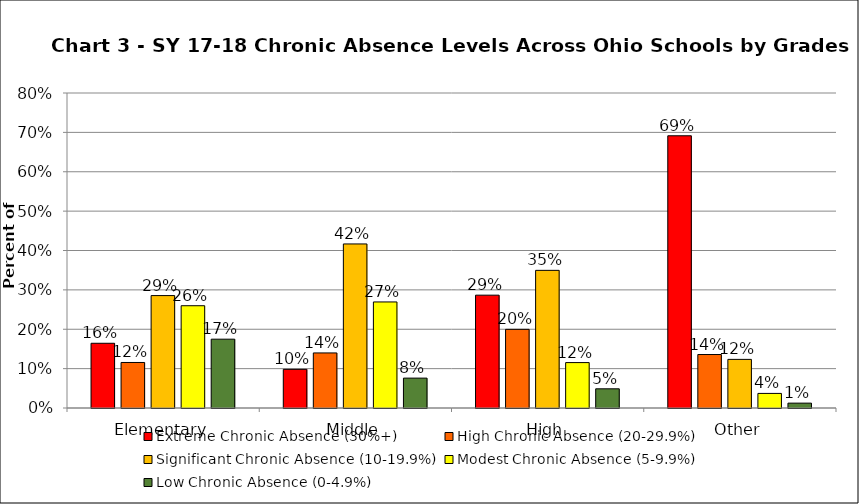
| Category | Extreme Chronic Absence (30%+) | High Chronic Absence (20-29.9%) | Significant Chronic Absence (10-19.9%) | Modest Chronic Absence (5-9.9%) | Low Chronic Absence (0-4.9%) |
|---|---|---|---|---|---|
| 0 | 0.164 | 0.116 | 0.285 | 0.26 | 0.175 |
| 1 | 0.098 | 0.14 | 0.417 | 0.269 | 0.076 |
| 2 | 0.287 | 0.2 | 0.35 | 0.115 | 0.049 |
| 3 | 0.691 | 0.136 | 0.123 | 0.037 | 0.012 |